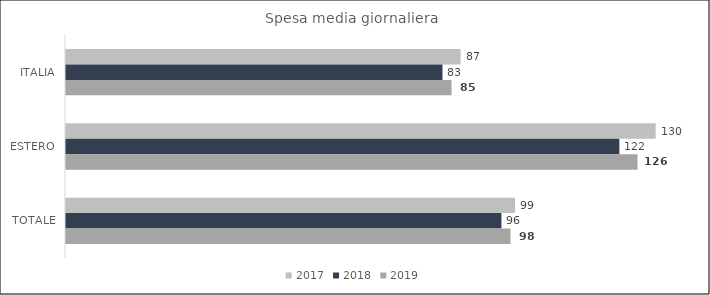
| Category | 2017 | 2018 | 2019 |
|---|---|---|---|
| ITALIA | 87 | 83 | 85 |
| ESTERO | 130 | 122 | 126 |
| TOTALE | 99 | 96 | 98 |